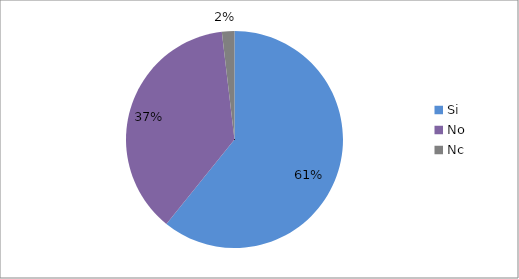
| Category | Series 0 | Series 1 | Series 2 |
|---|---|---|---|
| Si |  |  | 228 |
| No |  |  | 140 |
| Nc |  |  | 7 |